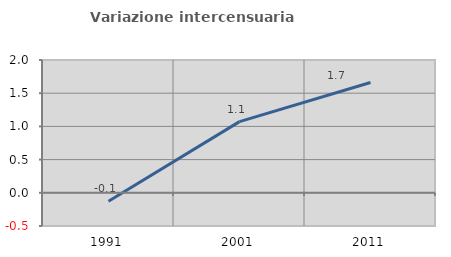
| Category | Variazione intercensuaria annua |
|---|---|
| 1991.0 | -0.128 |
| 2001.0 | 1.072 |
| 2011.0 | 1.662 |